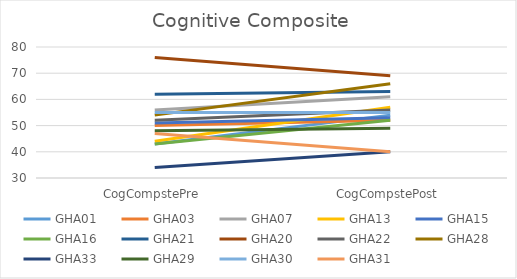
| Category | GHA01 | GHA03 | GHA07 | GHA13 | GHA15 | GHA16 | GHA21 | GHA20 | GHA22 | GHA28 | GHA33 | GHA29 | GHA30 | GHA31 |
|---|---|---|---|---|---|---|---|---|---|---|---|---|---|---|
| CogCompstePre | 43 | 50 | 56 | 44 | 51 | 43 | 62 | 76 | 52 | 54 | 34 | 48 | 55 | 47 |
| CogCompstePost | 54 | 52 | 61 | 57 | 53 | 52 | 63 | 69 | 56 | 66 | 40 | 49 | 55 | 40 |